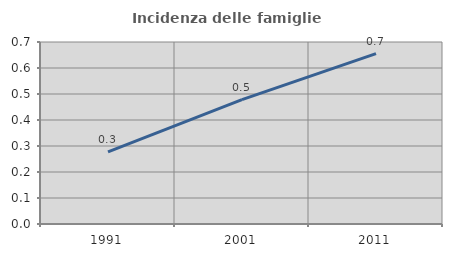
| Category | Incidenza delle famiglie numerose |
|---|---|
| 1991.0 | 0.278 |
| 2001.0 | 0.478 |
| 2011.0 | 0.655 |